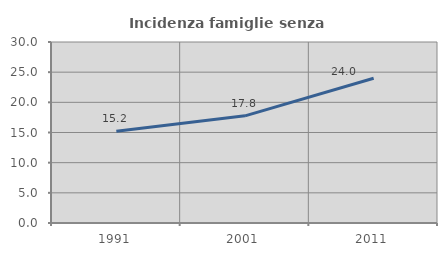
| Category | Incidenza famiglie senza nuclei |
|---|---|
| 1991.0 | 15.207 |
| 2001.0 | 17.763 |
| 2011.0 | 23.996 |